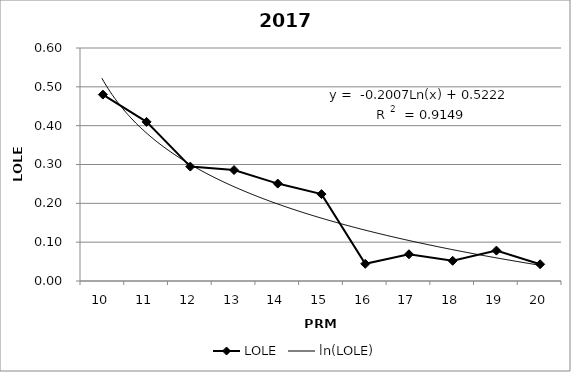
| Category | LOLE |
|---|---|
| 10.0 | 0.48 |
| 11.0 | 0.41 |
| 12.0 | 0.295 |
| 13.0 | 0.286 |
| 14.0 | 0.251 |
| 15.0 | 0.224 |
| 16.0 | 0.044 |
| 17.0 | 0.069 |
| 18.0 | 0.052 |
| 19.0 | 0.078 |
| 20.0 | 0.043 |